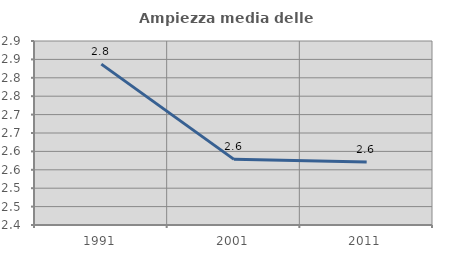
| Category | Ampiezza media delle famiglie |
|---|---|
| 1991.0 | 2.837 |
| 2001.0 | 2.578 |
| 2011.0 | 2.571 |